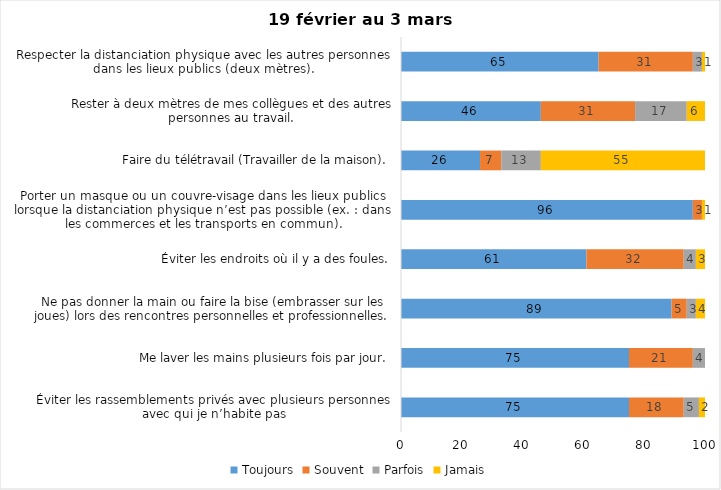
| Category | Toujours | Souvent | Parfois | Jamais |
|---|---|---|---|---|
| Éviter les rassemblements privés avec plusieurs personnes avec qui je n’habite pas | 75 | 18 | 5 | 2 |
| Me laver les mains plusieurs fois par jour. | 75 | 21 | 4 | 0 |
| Ne pas donner la main ou faire la bise (embrasser sur les joues) lors des rencontres personnelles et professionnelles. | 89 | 5 | 3 | 4 |
| Éviter les endroits où il y a des foules. | 61 | 32 | 4 | 3 |
| Porter un masque ou un couvre-visage dans les lieux publics lorsque la distanciation physique n’est pas possible (ex. : dans les commerces et les transports en commun). | 96 | 3 | 0 | 1 |
| Faire du télétravail (Travailler de la maison). | 26 | 7 | 13 | 55 |
| Rester à deux mètres de mes collègues et des autres personnes au travail. | 46 | 31 | 17 | 6 |
| Respecter la distanciation physique avec les autres personnes dans les lieux publics (deux mètres). | 65 | 31 | 3 | 1 |